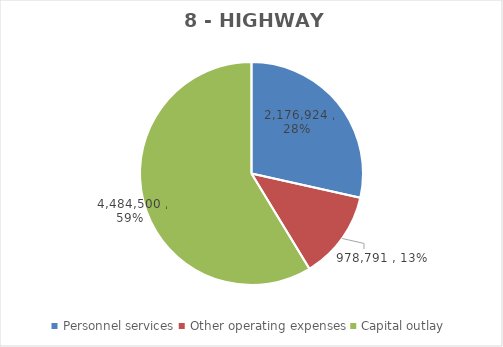
| Category | Series 0 | Series 1 | Series 2 | Series 3 | Series 4 | Series 5 | Series 6 |
|---|---|---|---|---|---|---|---|
| Personnel services | 2176924 |  |  | 1890324 | 2155426 | 2189086 | 2176924 |
| Other operating expenses | 978791 |  |  | 809015 | 893604 | 1028791 | 978791 |
| Capital outlay | 4484500 |  |  | 2723175 | 2267000 | 4684500 | 4484500 |